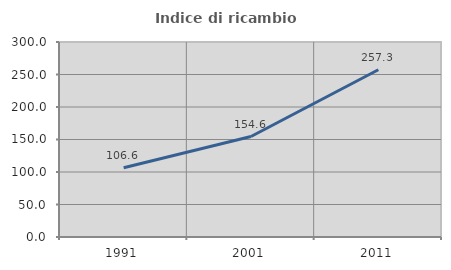
| Category | Indice di ricambio occupazionale  |
|---|---|
| 1991.0 | 106.627 |
| 2001.0 | 154.615 |
| 2011.0 | 257.343 |